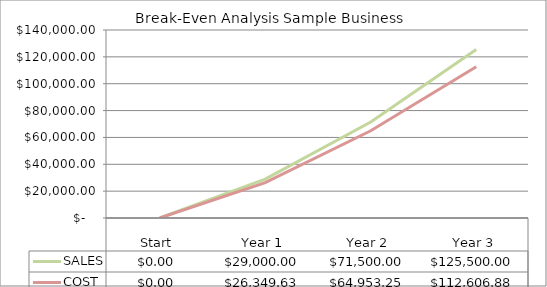
| Category | SALES | COST |
|---|---|---|
| Start | 0 | 0 |
| Year 1 | 29000 | 26349.625 |
| Year 2 | 71500 | 64953.25 |
| Year 3 | 125500 | 112606.875 |